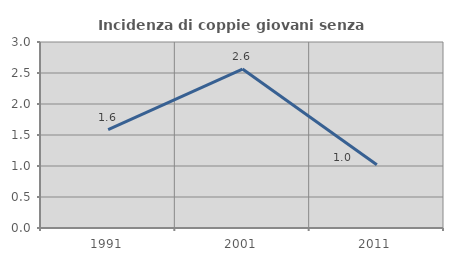
| Category | Incidenza di coppie giovani senza figli |
|---|---|
| 1991.0 | 1.587 |
| 2001.0 | 2.564 |
| 2011.0 | 1.02 |